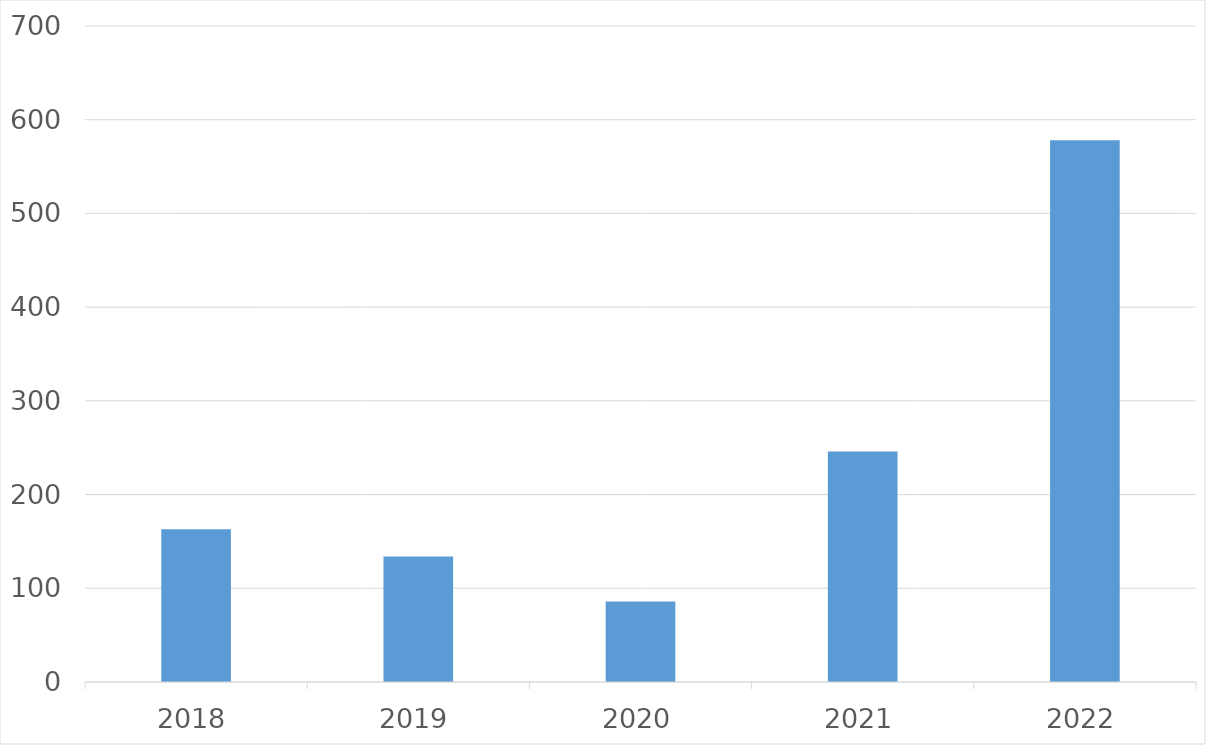
| Category | Series 0 |
|---|---|
| 2018 | 163 |
| 2019 | 134 |
| 2020 | 86 |
| 2021 | 246 |
| 2022 | 578 |